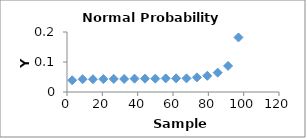
| Category | Series 0 |
|---|---|
| 2.9411764705882355 | 0.039 |
| 8.823529411764707 | 0.043 |
| 14.705882352941178 | 0.043 |
| 20.58823529411765 | 0.043 |
| 26.47058823529412 | 0.043 |
| 32.352941176470594 | 0.043 |
| 38.23529411764706 | 0.044 |
| 44.117647058823536 | 0.044 |
| 50.0 | 0.044 |
| 55.88235294117648 | 0.045 |
| 61.76470588235294 | 0.045 |
| 67.64705882352942 | 0.045 |
| 73.52941176470588 | 0.049 |
| 79.41176470588235 | 0.054 |
| 85.29411764705883 | 0.065 |
| 91.1764705882353 | 0.087 |
| 97.05882352941177 | 0.182 |